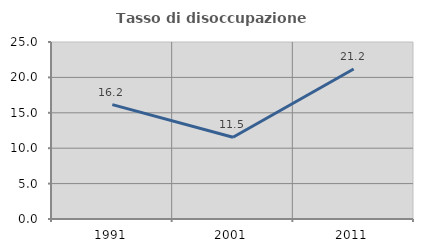
| Category | Tasso di disoccupazione giovanile  |
|---|---|
| 1991.0 | 16.155 |
| 2001.0 | 11.538 |
| 2011.0 | 21.186 |